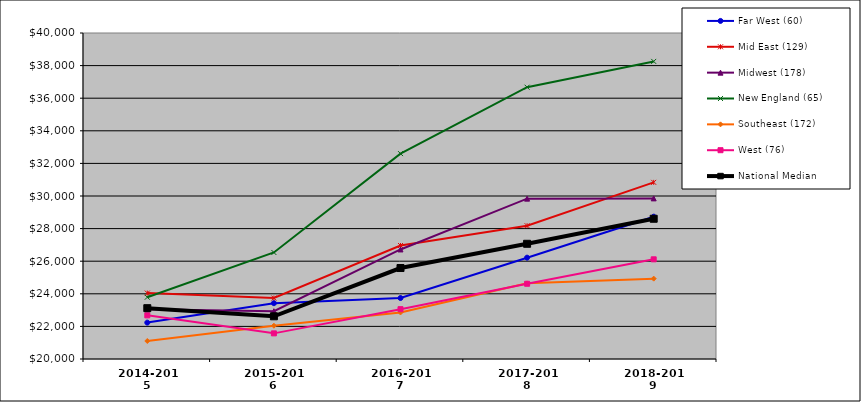
| Category | Far West (60) | Mid East (129) | Midwest (178) | New England (65) | Southeast (172) | West (76) | National Median |
|---|---|---|---|---|---|---|---|
| 2014-2015 | 22232.386 | 24043.411 | 23048.062 | 23791.089 | 21104.711 | 22677.301 | 23117.708 |
| 2015-2016 | 23425.246 | 23739.926 | 22930.871 | 26534.645 | 22043.343 | 21572.983 | 22619.893 |
| 2016-2017 | 23740.927 | 26962.771 | 26720.673 | 32601.991 | 22854.2 | 23057.422 | 25581.053 |
| 2017-2018 | 26216.335 | 28177.067 | 29838.001 | 36673.96 | 24639.962 | 24615.595 | 27067.87 |
| 2018-2019 | 28731.355 | 30836.949 | 29854.213 | 38257.832 | 24929.501 | 26115.103 | 28604.166 |